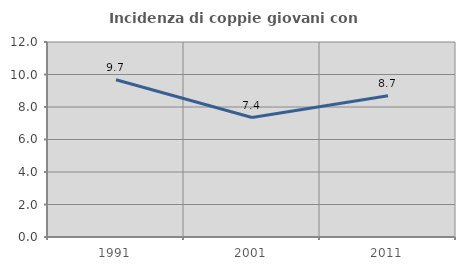
| Category | Incidenza di coppie giovani con figli |
|---|---|
| 1991.0 | 9.677 |
| 2001.0 | 7.353 |
| 2011.0 | 8.696 |